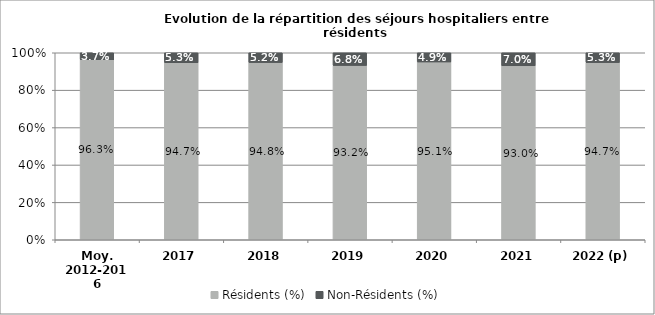
| Category | Résidents (%) | Non-Résidents (%) |
|---|---|---|
| Moy. 2012-2016 | 0.963 | 0.037 |
| 2017 | 0.947 | 0.053 |
| 2018 | 0.948 | 0.052 |
| 2019 | 0.932 | 0.068 |
| 2020 | 0.951 | 0.049 |
| 2021 | 0.93 | 0.07 |
| 2022 (p) | 0.947 | 0.053 |